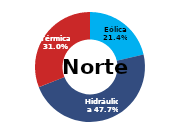
| Category | Norte |
|---|---|
| Eólica | 72.574 |
| Hidráulica | 162.046 |
| Solar | 0 |
| Térmica | 105.255 |